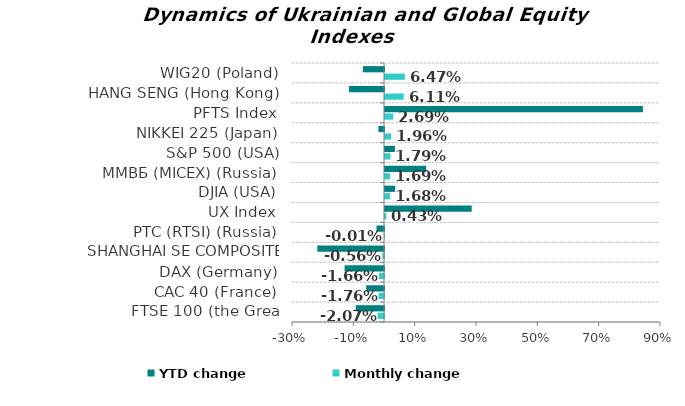
| Category | Monthly change | YTD change |
|---|---|---|
| FTSE 100 (the Great Britain) | -0.021 | -0.092 |
| CAC 40 (France) | -0.018 | -0.058 |
| DAX (Germany) | -0.017 | -0.129 |
| SHANGHAI SE COMPOSITE (China) | -0.006 | -0.217 |
| РТС (RTSI) (Russia) | 0 | -0.025 |
| UX Index | 0.004 | 0.283 |
| DJIA (USA) | 0.017 | 0.033 |
| ММВБ (MICEX) (Russia) | 0.017 | 0.134 |
| S&P 500 (USA) | 0.018 | 0.032 |
| NIKKEI 225 (Japan) | 0.02 | -0.018 |
| PFTS Index | 0.027 | 0.841 |
| HANG SENG (Hong Kong) | 0.061 | -0.114 |
| WIG20 (Poland) | 0.065 | -0.069 |